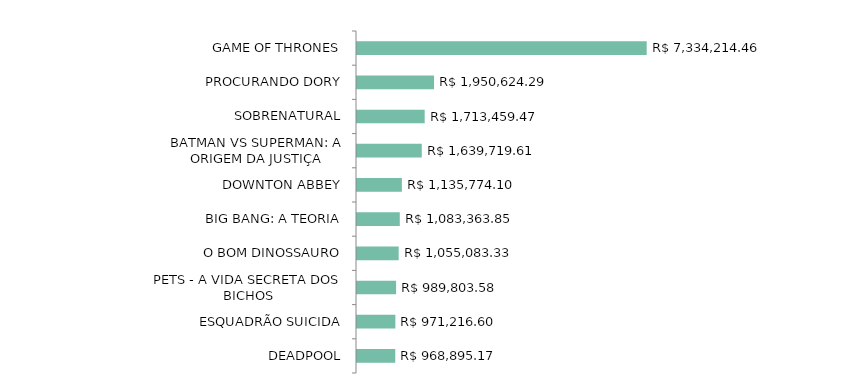
| Category | Series 0 |
|---|---|
| GAME OF THRONES | 7334214.46 |
| PROCURANDO DORY | 1950624.29 |
| SOBRENATURAL | 1713459.47 |
| BATMAN VS SUPERMAN: A ORIGEM DA JUSTIÇA | 1639719.61 |
| DOWNTON ABBEY | 1135774.1 |
| BIG BANG: A TEORIA | 1083363.85 |
| O BOM DINOSSAURO | 1055083.33 |
| PETS - A VIDA SECRETA DOS BICHOS | 989803.58 |
| ESQUADRÃO SUICIDA | 971216.6 |
| DEADPOOL | 968895.17 |